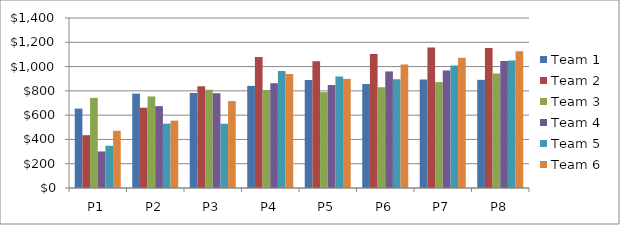
| Category | Team 1 | Team 2 | Team 3 | Team 4 | Team 5 | Team 6 |
|---|---|---|---|---|---|---|
| P1 | 654 | 435 | 742 | 301 | 348 | 471 |
| P2 | 777 | 661 | 753 | 674 | 530 | 555 |
| P3 | 783 | 837 | 809 | 780 | 529 | 716 |
| P4 | 841 | 1079 | 807 | 863 | 964 | 938 |
| P5 | 890 | 1044 | 790 | 848 | 919 | 899 |
| P6 | 856 | 1104 | 830 | 960 | 896 | 1017 |
| P7 | 894 | 1158 | 872 | 967 | 1008 | 1073 |
| P8 | 891 | 1152 | 942 | 1046 | 1051 | 1127 |